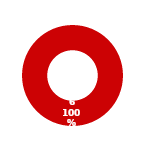
| Category | APM |
|---|---|
| MIL 3 Complete | 0 |
| MIL 3 Not Complete | 6 |